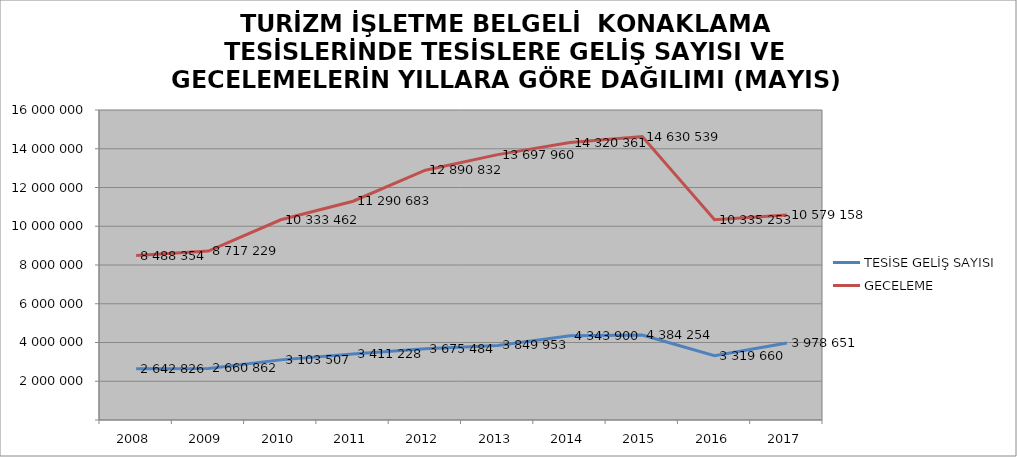
| Category | TESİSE GELİŞ SAYISI | GECELEME |
|---|---|---|
| 2008 | 2642826 | 8488354 |
| 2009 | 2660862 | 8717229 |
| 2010 | 3103507 | 10333462 |
| 2011 | 3411228 | 11290683 |
| 2012 | 3675484 | 12890832 |
| 2013 | 3849953 | 13697960 |
| 2014 | 4343900 | 14320361 |
| 2015 | 4384254 | 14630539 |
| 2016 | 3319660 | 10335253 |
| 2017 | 3978651 | 10579158 |